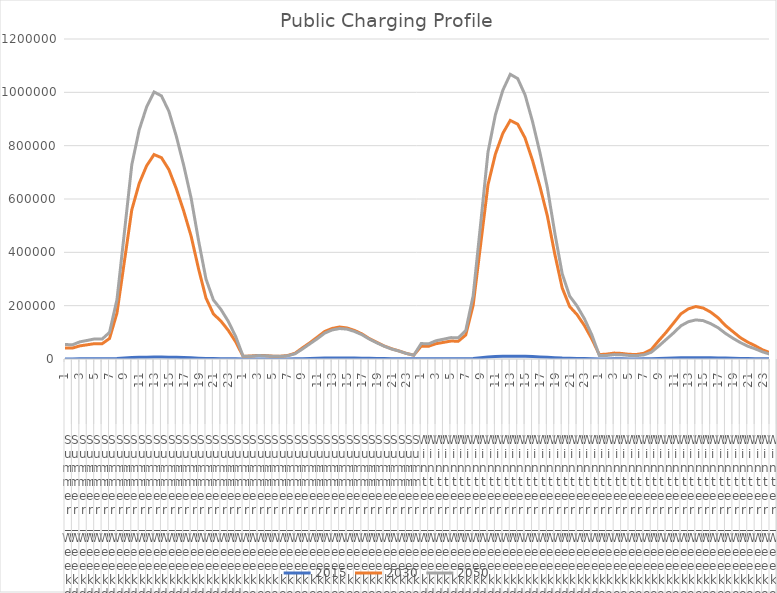
| Category | 2015 | 2030 | 2050 |
|---|---|---|---|
| 0 | 397.86 | 41421 | 54382 |
| 1 | 389.82 | 40970 | 53284 |
| 2 | 470.2 | 49215 | 64270 |
| 3 | 509.38 | 53374 | 69626 |
| 4 | 550.58 | 57630 | 75257 |
| 5 | 546.56 | 57148 | 74707 |
| 6 | 730.42 | 76926 | 99839 |
| 7 | 1627.6 | 172080 | 222480 |
| 8 | 3464.2 | 365350 | 473510 |
| 9 | 5327.9 | 559290 | 728260 |
| 10 | 6288.4 | 658530 | 859550 |
| 11 | 6917.4 | 724740 | 945510 |
| 12 | 7327.3 | 766660 | 1001500 |
| 13 | 7217.8 | 754840 | 986570 |
| 14 | 6794.8 | 710140 | 928760 |
| 15 | 6111.6 | 638440 | 835370 |
| 16 | 5309.9 | 554480 | 725790 |
| 17 | 4409.6 | 460120 | 602740 |
| 18 | 3245.2 | 337790 | 443570 |
| 19 | 2193.3 | 228520 | 299790 |
| 20 | 1618.6 | 168820 | 221240 |
| 21 | 1363.4 | 142510 | 186360 |
| 22 | 1033.8 | 107450 | 141310 |
| 23 | 616.89 | 64187 | 84320 |
| 24 | 350.69 | 10097 | 9985.6 |
| 25 | 361.43 | 11182 | 10292 |
| 26 | 450.89 | 13514 | 12839 |
| 27 | 433 | 12726 | 12329 |
| 28 | 365.01 | 10680 | 10393 |
| 29 | 343.54 | 10315 | 9782.3 |
| 30 | 425.84 | 13062 | 12126 |
| 31 | 687.07 | 21533 | 19565 |
| 32 | 1320.5 | 41761 | 37603 |
| 33 | 2000.4 | 60923 | 56962 |
| 34 | 2673.2 | 82030 | 76120 |
| 35 | 3410.3 | 103290 | 97110 |
| 36 | 3825.4 | 114600 | 108930 |
| 37 | 4011.5 | 119950 | 114230 |
| 38 | 3936.4 | 116470 | 112090 |
| 39 | 3628.6 | 107260 | 103320 |
| 40 | 3209.9 | 94219 | 91401 |
| 41 | 2626.6 | 76504 | 74791 |
| 42 | 2132.8 | 62612 | 60730 |
| 43 | 1689.1 | 48840 | 48094 |
| 44 | 1313.3 | 38566 | 37396 |
| 45 | 1044.9 | 30235 | 29753 |
| 46 | 730.02 | 20929 | 20786 |
| 47 | 497.41 | 14371 | 14163 |
| 48 | 599.9 | 48250 | 57968 |
| 49 | 573.07 | 47900 | 56798 |
| 50 | 682.55 | 57449 | 68508 |
| 51 | 743.73 | 62329 | 74217 |
| 52 | 803.6 | 67272 | 80219 |
| 53 | 801.08 | 66681 | 79633 |
| 54 | 1058.3 | 90008 | 106420 |
| 55 | 2322 | 201630 | 237150 |
| 56 | 4942.6 | 427710 | 504740 |
| 57 | 7665.2 | 653590 | 776280 |
| 58 | 9139.8 | 768840 | 916220 |
| 59 | 10091 | 846300 | 1007900 |
| 60 | 10704 | 894790 | 1067600 |
| 61 | 10585 | 880840 | 1051600 |
| 62 | 9987.9 | 828470 | 990000 |
| 63 | 9006.8 | 744690 | 890460 |
| 64 | 7841.2 | 646660 | 773640 |
| 65 | 6529.1 | 536460 | 642480 |
| 66 | 4841.3 | 393450 | 472820 |
| 67 | 3295.3 | 266290 | 319560 |
| 68 | 2416.3 | 196800 | 235830 |
| 69 | 2018.3 | 166270 | 198640 |
| 70 | 1538 | 125090 | 150630 |
| 71 | 936.33 | 74754 | 89880 |
| 72 | 439.43 | 16564 | 12815 |
| 73 | 452.88 | 18347 | 13208 |
| 74 | 564.98 | 22173 | 16477 |
| 75 | 542.56 | 20878 | 15823 |
| 76 | 457.36 | 17522 | 13338 |
| 77 | 430.46 | 16924 | 12554 |
| 78 | 533.59 | 21432 | 15562 |
| 79 | 860.92 | 35333 | 25109 |
| 80 | 1654.6 | 68525 | 48258 |
| 81 | 2506.5 | 99958 | 73102 |
| 82 | 3349.5 | 134590 | 97688 |
| 83 | 4273.2 | 169470 | 124620 |
| 84 | 4793.4 | 188020 | 139790 |
| 85 | 5026.5 | 196790 | 146590 |
| 86 | 4932.4 | 191090 | 143840 |
| 87 | 4546.7 | 175980 | 132600 |
| 88 | 4022.1 | 154570 | 117300 |
| 89 | 3291.2 | 125510 | 95981 |
| 90 | 2672.4 | 102720 | 77936 |
| 91 | 2116.4 | 80123 | 61720 |
| 92 | 1645.6 | 63270 | 47991 |
| 93 | 1309.3 | 49601 | 38183 |
| 94 | 914.73 | 34334 | 26675 |
| 95 | 623.27 | 23576 | 18176 |